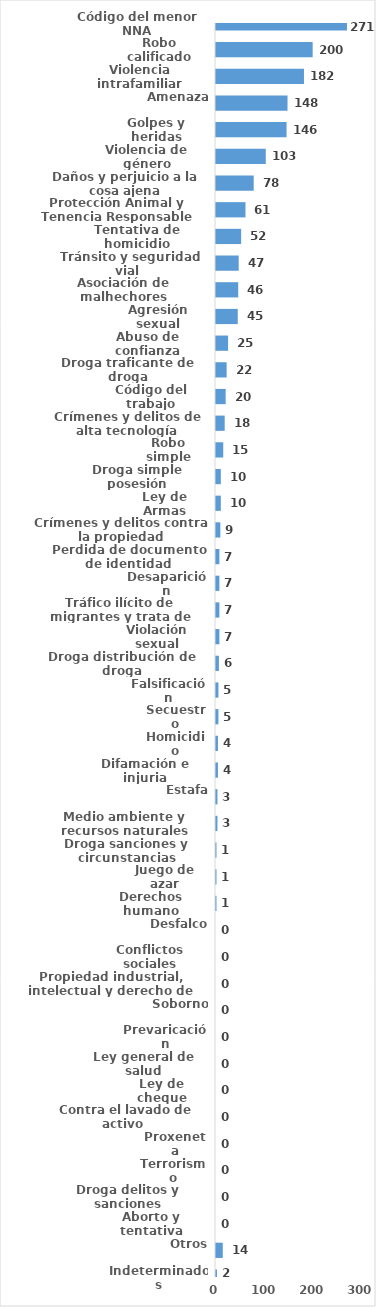
| Category | Series 0 |
|---|---|
| Código del menor NNA | 271 |
| Robo calificado | 200 |
| Violencia intrafamiliar | 182 |
| Amenaza | 148 |
| Golpes y heridas | 146 |
| Violencia de género | 103 |
| Daños y perjuicio a la cosa ajena | 78 |
| Protección Animal y Tenencia Responsable | 61 |
| Tentativa de homicidio | 52 |
| Tránsito y seguridad vial  | 47 |
| Asociación de malhechores | 46 |
| Agresión sexual | 45 |
| Abuso de confianza | 25 |
| Droga traficante de droga | 22 |
| Código del trabajo | 20 |
| Crímenes y delitos de alta tecnología | 18 |
| Robo simple | 15 |
| Droga simple posesión | 10 |
| Ley de Armas | 10 |
| Crímenes y delitos contra la propiedad | 9 |
| Perdida de documento de identidad | 7 |
| Desaparición | 7 |
| Tráfico ilícito de migrantes y trata de personas | 7 |
| Violación sexual | 7 |
| Droga distribución de droga | 6 |
| Falsificación | 5 |
| Secuestro | 5 |
| Homicidio | 4 |
| Difamación e injuria | 4 |
| Estafa | 3 |
| Medio ambiente y recursos naturales | 3 |
| Droga sanciones y circunstancias agravantes | 1 |
| Juego de azar | 1 |
| Derechos humano | 1 |
| Desfalco | 0 |
| Conflictos sociales | 0 |
| Propiedad industrial, intelectual y derecho de autor | 0 |
| Soborno | 0 |
| Prevaricación | 0 |
| Ley general de salud | 0 |
| Ley de cheque | 0 |
| Contra el lavado de activo  | 0 |
| Proxeneta | 0 |
| Terrorismo | 0 |
| Droga delitos y sanciones | 0 |
| Aborto y tentativa | 0 |
| Otros | 14 |
| Indeterminados | 2 |